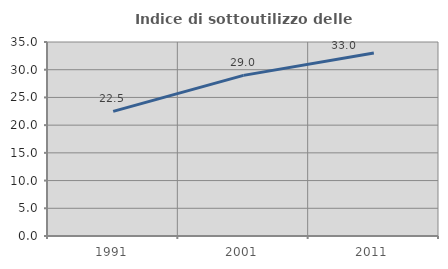
| Category | Indice di sottoutilizzo delle abitazioni  |
|---|---|
| 1991.0 | 22.486 |
| 2001.0 | 28.979 |
| 2011.0 | 33.023 |